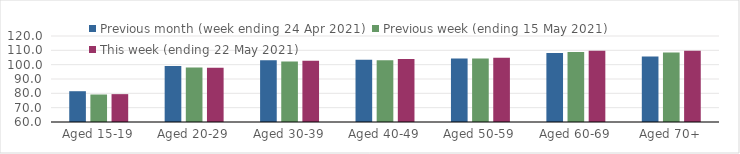
| Category | Previous month (week ending 24 Apr 2021) | Previous week (ending 15 May 2021) | This week (ending 22 May 2021) |
|---|---|---|---|
| Aged 15-19 | 81.48 | 79.18 | 79.44 |
| Aged 20-29 | 99 | 98.08 | 97.9 |
| Aged 30-39 | 103.02 | 102.29 | 102.71 |
| Aged 40-49 | 103.39 | 103.07 | 103.93 |
| Aged 50-59 | 104.33 | 104.33 | 104.91 |
| Aged 60-69 | 108.12 | 108.9 | 109.71 |
| Aged 70+ | 105.67 | 108.53 | 109.77 |